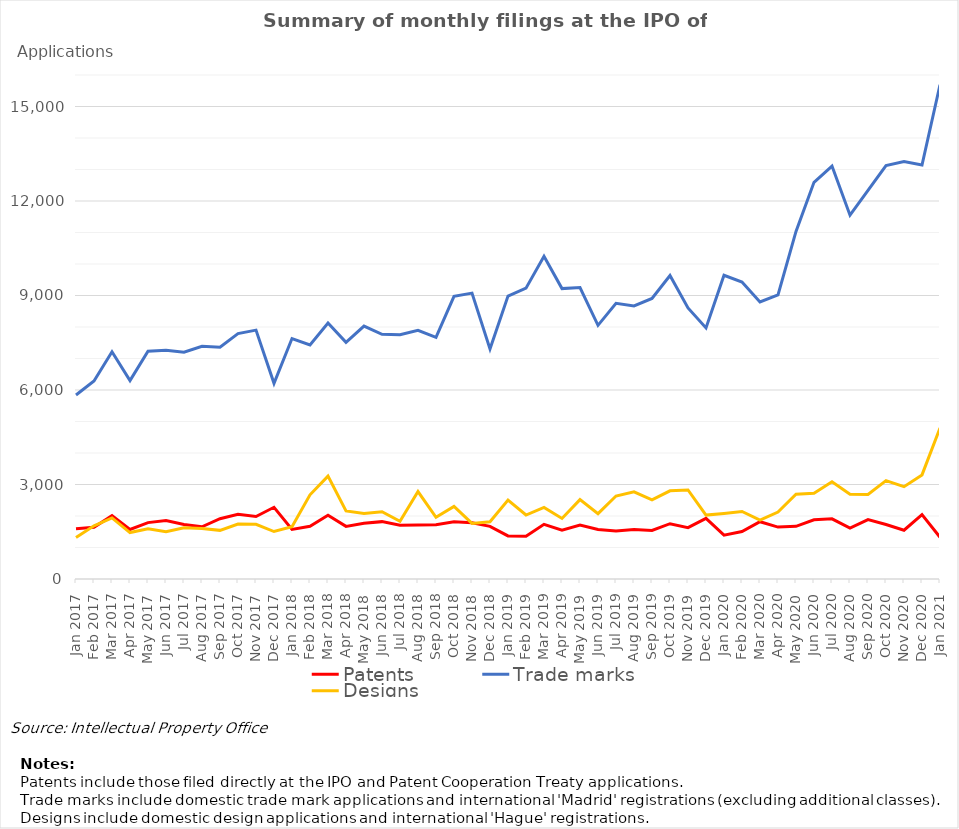
| Category | Patents | Trade marks | Designs |
|---|---|---|---|
| Jan 2017 | 1596 | 5843 | 1318 |
| Feb 2017 | 1640 | 6288 | 1687 |
| Mar 2017 | 2011 | 7214 | 1940 |
| Apr 2017 | 1573 | 6297 | 1474 |
| May 2017 | 1790 | 7234 | 1592 |
| Jun 2017 | 1853 | 7263 | 1502 |
| Jul 2017 | 1730 | 7197 | 1627 |
| Aug 2017 | 1657 | 7389 | 1600 |
| Sep 2017 | 1915 | 7359 | 1544 |
| Oct 2017 | 2055 | 7792 | 1745 |
| Nov 2017 | 1983 | 7901 | 1736 |
| Dec 2017 | 2277 | 6211 | 1507 |
| Jan 2018 | 1575 | 7634 | 1658 |
| Feb 2018 | 1676 | 7428 | 2672 |
| Mar 2018 | 2022 | 8127 | 3267 |
| Apr 2018 | 1670 | 7512 | 2160 |
| May 2018 | 1767 | 8030 | 2083 |
| Jun 2018 | 1821 | 7769 | 2136 |
| Jul 2018 | 1704 | 7757 | 1832 |
| Aug 2018 | 1713 | 7897 | 2777 |
| Sep 2018 | 1725 | 7673 | 1960 |
| Oct 2018 | 1818 | 8972 | 2302 |
| Nov 2018 | 1787 | 9076 | 1765 |
| Dec 2018 | 1670 | 7304 | 1815 |
| Jan 2019 | 1367 | 8984 | 2505 |
| Feb 2019 | 1361 | 9234 | 2031 |
| Mar 2019 | 1737 | 10243 | 2274 |
| Apr 2019 | 1552 | 9219 | 1923 |
| May 2019 | 1710 | 9251 | 2520 |
| Jun 2019 | 1569 | 8053 | 2074 |
| Jul 2019 | 1527 | 8752 | 2634 |
| Aug 2019 | 1571 | 8670 | 2768 |
| Sep 2019 | 1540 | 8907 | 2511 |
| Oct 2019 | 1755 | 9636 | 2800 |
| Nov 2019 | 1630 | 8607 | 2827 |
| Dec 2019 | 1926 | 7970 | 2028 |
| Jan 2020 | 1392 | 9642 | 2082 |
| Feb 2020 | 1506 | 9428 | 2143 |
| Mar 2020 | 1819 | 8794 | 1871 |
| Apr 2020 | 1648 | 9021 | 2127 |
| May 2020 | 1671 | 11035 | 2694 |
| Jun 2020 | 1880 | 12593 | 2721 |
| Jul 2020 | 1911 | 13110 | 3085 |
| Aug 2020 | 1616 | 11551 | 2694 |
| Sep 2020 | 1886 | 12340 | 2686 |
| Oct 2020 | 1731 | 13126 | 3124 |
| Nov 2020 | 1548 | 13254 | 2932 |
| Dec 2020 | 2045 | 13144 | 3305 |
| Jan 2021 | 1326 | 15688 | 4794 |